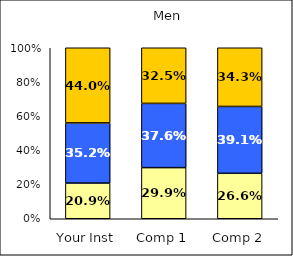
| Category | Low Satisfaction with Coursework | Average Satisfaction with Coursework | High Satisfaction with Coursework |
|---|---|---|---|
| Your Inst | 0.209 | 0.352 | 0.44 |
| Comp 1 | 0.299 | 0.376 | 0.325 |
| Comp 2 | 0.266 | 0.391 | 0.343 |